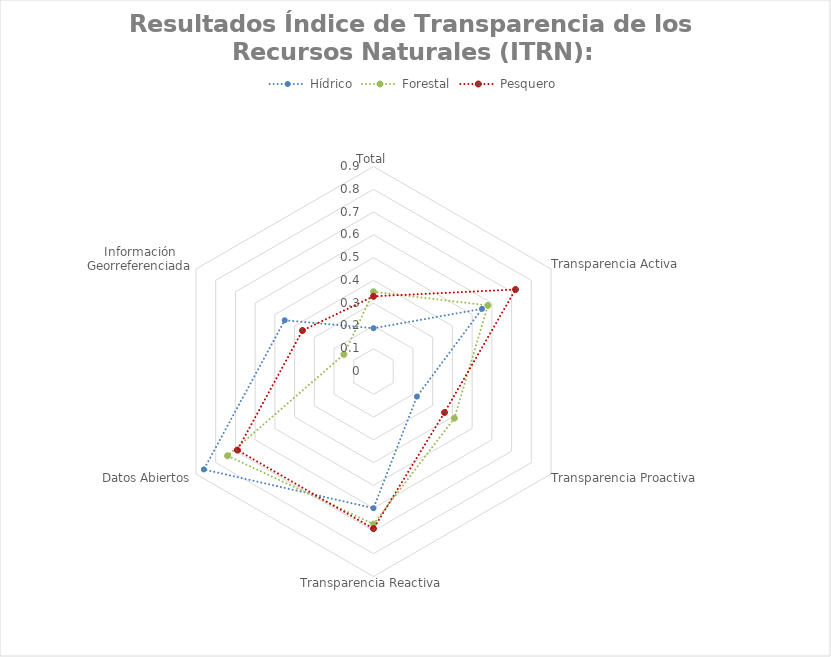
| Category | Hídrico | Forestal | Pesquero |
|---|---|---|---|
| Total | 0.19 | 0.35 | 0.33 |
| Transparencia Activa | 0.55 | 0.58 | 0.72 |
| Transparencia Proactiva | 0.22 | 0.41 | 0.36 |
| Transparencia Reactiva | 0.6 | 0.67 | 0.69 |
| Datos Abiertos | 0.86 | 0.74 | 0.69 |
| Información Georreferenciada | 0.45 | 0.15 | 0.36 |